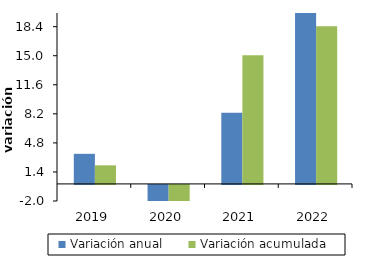
| Category | Variación anual | Variación acumulada |
|---|---|---|
| 2019-05-01 | 3.52 | 2.173 |
| 2020-05-01 | -26.399 | -13.016 |
| 2021-05-01 | 8.32 | 15.066 |
| 2022-05-01 | 46.228 | 18.448 |